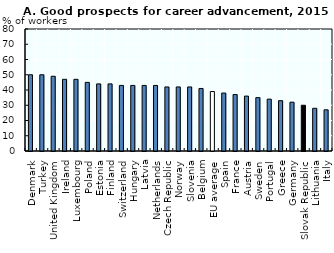
| Category | Series 0 |
|---|---|
| Denmark | 50 |
| Turkey | 50 |
| United Kingdom | 49 |
| Ireland | 47 |
| Luxembourg | 47 |
| Poland | 45 |
| Estonia | 44 |
| Finland | 44 |
| Switzerland | 43 |
| Hungary | 43 |
| Latvia | 43 |
| Netherlands | 43 |
| Czech Republic | 42 |
| Norway | 42 |
| Slovenia | 42 |
| Belgium | 41 |
| EU average | 39 |
| Spain | 38 |
| France | 37 |
| Austria | 36 |
| Sweden | 35 |
| Portugal | 34 |
| Greece | 33 |
| Germany | 32 |
| Slovak Republic | 30 |
| Lithuania | 28 |
| Italy | 27 |